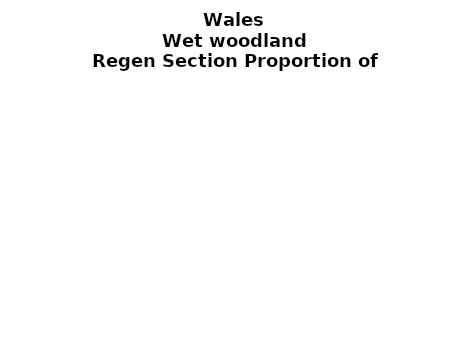
| Category | Wet woodland |
|---|---|
| None | 0.048 |
| Seedlings only | 0 |
| Seedlings, saplings only | 0.015 |
| Seedlings, saplings, <7 cm trees | 0.074 |
| Saplings only | 0.198 |
| <7 cm trees, seedlings only | 0 |
| <7 cm trees, saplings only | 0.604 |
| <7 cm Trees only | 0.06 |